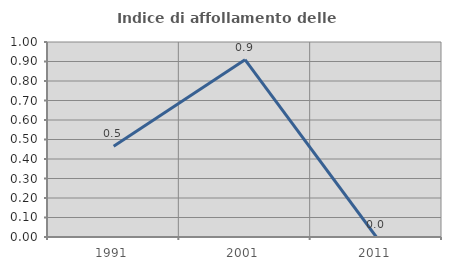
| Category | Indice di affollamento delle abitazioni  |
|---|---|
| 1991.0 | 0.465 |
| 2001.0 | 0.909 |
| 2011.0 | 0 |